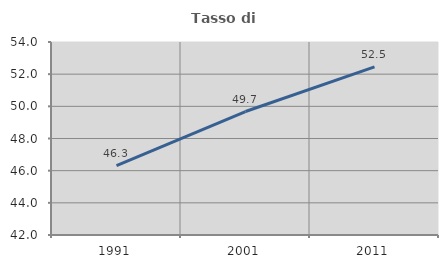
| Category | Tasso di occupazione   |
|---|---|
| 1991.0 | 46.32 |
| 2001.0 | 49.677 |
| 2011.0 | 52.456 |